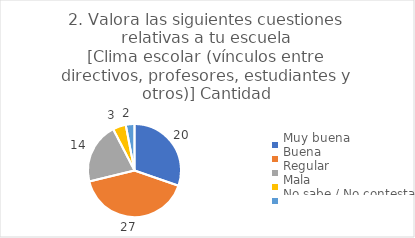
| Category | 2. Valora las siguientes cuestiones relativas a tu escuela
[Clima escolar (vínculos entre directivos, profesores, estudiantes y otros)] |
|---|---|
| Muy buena  | 0.303 |
| Buena  | 0.409 |
| Regular  | 0.212 |
| Mala  | 0.045 |
| No sabe / No contesta | 0.03 |